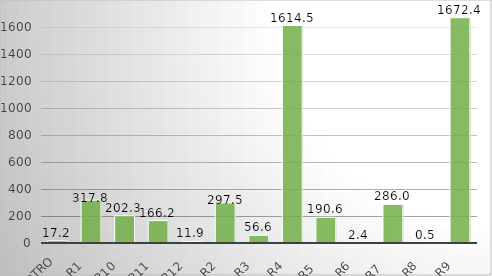
| Category | Series 0 |
|---|---|
| Otro | 17.186 |
| R1   | 317.767 |
| R10   | 202.298 |
| R11   | 166.206 |
| R12   | 11.872 |
| R2   | 297.538 |
| R3   | 56.606 |
| R4   | 1614.544 |
| R5    | 190.614 |
| R6   | 2.418 |
| R7    | 286.021 |
| R8   | 0.481 |
| R9   | 1672.38 |